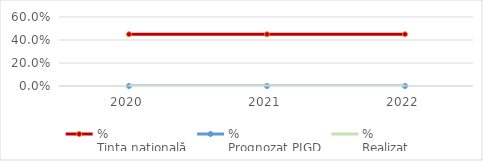
| Category | %
Ținta națională | % 
Prognozat PJGD | % 
Realizat |
|---|---|---|---|
| 2020.0 | 0.45 | 0 | 0 |
| 2021.0 | 0.45 | 0 | 0 |
| 2022.0 | 0.45 | 0 | 0 |